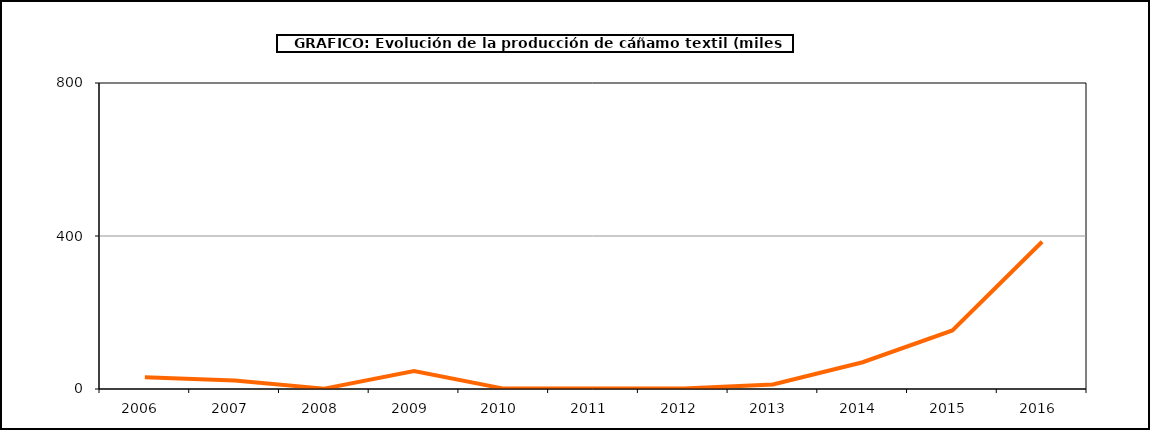
| Category | Producción |
|---|---|
| 2006.0 | 31 |
| 2007.0 | 22 |
| 2008.0 | 1 |
| 2009.0 | 47 |
| 2010.0 | 1 |
| 2011.0 | 1 |
| 2012.0 | 1 |
| 2013.0 | 12 |
| 2014.0 | 70 |
| 2015.0 | 153 |
| 2016.0 | 385 |